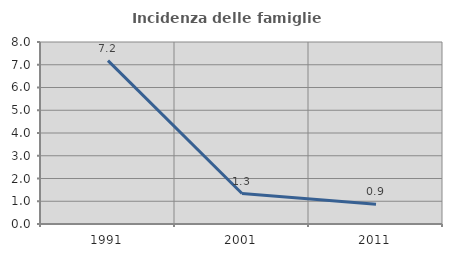
| Category | Incidenza delle famiglie numerose |
|---|---|
| 1991.0 | 7.182 |
| 2001.0 | 1.34 |
| 2011.0 | 0.872 |